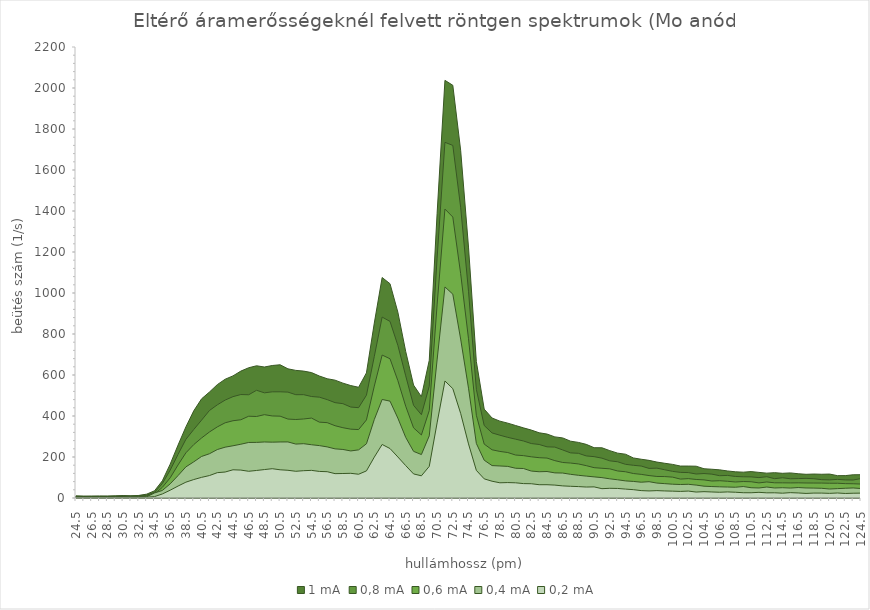
| Category | 1 mA | 0,8 mA | 0,6 mA | 0,4 mA | 0,2 mA |
|---|---|---|---|---|---|
| 24.5 | 10.4 | 7.5 | 6 | 3.8 | 2.1 |
| 25.5 | 9.5 | 7.2 | 4.8 | 4 | 1.8 |
| 26.5 | 9.4 | 7.8 | 6.3 | 4 | 2.1 |
| 27.5 | 10.2 | 7.3 | 5.8 | 4.3 | 2 |
| 28.5 | 9.4 | 8.3 | 6.4 | 4.8 | 2.3 |
| 29.5 | 10.6 | 8.5 | 6.3 | 4.5 | 2.1 |
| 30.5 | 12.1 | 8.6 | 7.7 | 5.3 | 2.8 |
| 31.5 | 10.8 | 9.3 | 7.2 | 5.6 | 2.5 |
| 32.5 | 12.5 | 11.8 | 7.1 | 6 | 2.6 |
| 33.5 | 18.8 | 14.2 | 10.3 | 6 | 3.7 |
| 34.5 | 35 | 26.8 | 19.9 | 24.6 | 6.8 |
| 35.5 | 83.8 | 70.4 | 52 | 36.8 | 19.7 |
| 36.5 | 165.2 | 135.9 | 98.4 | 69 | 38.1 |
| 37.5 | 258.1 | 212.7 | 161.3 | 109.4 | 58.3 |
| 38.5 | 346.8 | 286.1 | 220.4 | 151.8 | 77.2 |
| 39.5 | 425.1 | 334.1 | 260.5 | 176.3 | 90 |
| 40.5 | 483.9 | 379.9 | 292.9 | 202.7 | 100.7 |
| 41.5 | 516.9 | 426.7 | 322.1 | 215.8 | 109.5 |
| 42.5 | 553 | 454.4 | 346.8 | 236.3 | 123.6 |
| 43.5 | 579.4 | 477.6 | 366.9 | 247.9 | 126.7 |
| 44.5 | 595.7 | 494.5 | 376.9 | 254.8 | 137.6 |
| 45.5 | 619 | 504.7 | 381.7 | 262.3 | 136.2 |
| 46.5 | 635.4 | 503.6 | 398.9 | 270.9 | 130.3 |
| 47.5 | 644.9 | 525.4 | 397.6 | 271.3 | 134.3 |
| 48.5 | 639 | 513 | 406.5 | 273.3 | 138.7 |
| 49.5 | 646.3 | 517.9 | 400.2 | 272.4 | 142.9 |
| 50.5 | 649.9 | 518 | 399.2 | 273.3 | 137.6 |
| 51.5 | 630.1 | 516.5 | 385 | 273.5 | 135.2 |
| 52.5 | 622.5 | 503.9 | 382.9 | 263.1 | 130.3 |
| 53.5 | 619 | 504.1 | 385.4 | 264.9 | 133.2 |
| 54.5 | 611.8 | 495 | 389.9 | 259.8 | 134.8 |
| 55.5 | 595.1 | 491.9 | 370 | 255.6 | 129.6 |
| 56.5 | 581.8 | 479.9 | 367.6 | 249.3 | 128.3 |
| 57.5 | 574.8 | 465.1 | 352.6 | 239.7 | 118.8 |
| 58.5 | 560.3 | 460.2 | 342.9 | 236.8 | 119.5 |
| 59.5 | 548.5 | 443.6 | 335.8 | 229.5 | 120.4 |
| 60.5 | 540.1 | 440.6 | 333.8 | 234.8 | 115.9 |
| 61.5 | 610.3 | 501.5 | 380.9 | 264.4 | 132.2 |
| 62.5 | 853.5 | 690.4 | 545.8 | 383 | 199.4 |
| 63.5 | 1075.5 | 882.6 | 697.3 | 480.6 | 261.1 |
| 64.5 | 1045.3 | 861.4 | 679.2 | 472.5 | 241.3 |
| 65.5 | 906.5 | 744.6 | 572.5 | 389.6 | 200.2 |
| 66.5 | 715 | 596 | 447.8 | 295.8 | 158.1 |
| 67.5 | 550.9 | 452.1 | 342.2 | 227.5 | 117.5 |
| 68.5 | 494.3 | 406.4 | 307.5 | 211.9 | 108.3 |
| 69.5 | 671.5 | 545.2 | 426.6 | 302.9 | 154.2 |
| 70.5 | 1387.6 | 1170 | 941.8 | 673.5 | 366.4 |
| 71.5 | 2037.3 | 1735 | 1409.5 | 1029.5 | 570.8 |
| 72.5 | 2013.3 | 1719.9 | 1370.5 | 994.4 | 533.5 |
| 73.5 | 1696.3 | 1418.5 | 1094.5 | 775.2 | 412.8 |
| 74.5 | 1224 | 1008.5 | 776.8 | 535.6 | 263.8 |
| 75.5 | 665.6 | 529.6 | 403.4 | 266.1 | 134.7 |
| 76.5 | 433.6 | 353.6 | 262.9 | 184.4 | 93.4 |
| 77.5 | 390.2 | 317.4 | 235.2 | 158.1 | 81.8 |
| 78.5 | 374.9 | 306.2 | 227.1 | 156.2 | 74.2 |
| 79.5 | 365.1 | 295.8 | 221.8 | 154.2 | 75.3 |
| 80.5 | 353.6 | 286.9 | 209.6 | 145.1 | 74.1 |
| 81.5 | 342.1 | 278.1 | 206.7 | 143.9 | 70.2 |
| 82.5 | 331.4 | 265.6 | 200.9 | 131.4 | 69.6 |
| 83.5 | 318.2 | 261.1 | 196.6 | 128.1 | 64.8 |
| 84.5 | 311.9 | 249.6 | 194.8 | 129.2 | 64.8 |
| 85.5 | 298.1 | 248.3 | 182.3 | 122.5 | 62.9 |
| 86.5 | 293.1 | 234.4 | 173.3 | 121.7 | 59 |
| 87.5 | 277.2 | 220.1 | 170.5 | 115.5 | 57.1 |
| 88.5 | 271.2 | 218 | 166.1 | 110.8 | 55.7 |
| 89.5 | 261.6 | 205.2 | 157.8 | 106.8 | 53.5 |
| 90.5 | 245.4 | 201.7 | 148 | 103 | 54.2 |
| 91.5 | 245 | 194.3 | 145 | 99.4 | 45.5 |
| 92.5 | 231 | 181.3 | 142.2 | 93.5 | 47.3 |
| 93.5 | 218.9 | 176.7 | 131.8 | 88.8 | 46.6 |
| 94.5 | 213.6 | 164.3 | 128 | 83.4 | 43.4 |
| 95.5 | 195.4 | 159.6 | 119.4 | 80.8 | 40.7 |
| 96.5 | 189.1 | 155.9 | 115.3 | 77 | 36.1 |
| 97.5 | 183.6 | 144.4 | 109.5 | 79.5 | 34.4 |
| 98.5 | 175.3 | 145.6 | 105.1 | 72.8 | 36 |
| 99.5 | 169.4 | 137.8 | 104.5 | 70 | 34.4 |
| 100.5 | 163.9 | 129.9 | 101.8 | 67.3 | 33.4 |
| 101.5 | 155.8 | 125 | 92.2 | 65.8 | 32.1 |
| 102.5 | 155.8 | 124 | 94.5 | 66.9 | 33.8 |
| 103.5 | 155.1 | 117 | 90.4 | 63 | 29 |
| 104.5 | 142.7 | 119.3 | 88.3 | 57.6 | 30.9 |
| 105.5 | 140.3 | 116.4 | 82.8 | 55.8 | 29.4 |
| 106.5 | 137.2 | 108.7 | 84.3 | 54.5 | 28 |
| 107.5 | 131.9 | 110.2 | 81.6 | 53.5 | 29.6 |
| 108.5 | 127.8 | 105 | 78.1 | 52.5 | 28.1 |
| 109.5 | 126 | 103.5 | 80.3 | 55.9 | 25.7 |
| 110.5 | 128.8 | 103 | 79.3 | 50.1 | 25.6 |
| 111.5 | 125 | 99.5 | 73.7 | 48.8 | 27.6 |
| 112.5 | 121.2 | 103.8 | 78.2 | 53.5 | 25.2 |
| 113.5 | 123.5 | 94.2 | 74.1 | 48.8 | 25.4 |
| 114.5 | 120.5 | 98.8 | 74 | 50.2 | 23.4 |
| 115.5 | 122.4 | 93.8 | 73.5 | 48.4 | 26.1 |
| 116.5 | 118.3 | 94.6 | 74 | 51 | 24.6 |
| 117.5 | 115.6 | 95.8 | 73.2 | 48.9 | 22.3 |
| 118.5 | 116.9 | 94 | 73 | 48.3 | 24 |
| 119.5 | 115.8 | 89.4 | 72.8 | 47.3 | 23.9 |
| 120.5 | 116.7 | 88.4 | 72 | 43.8 | 22.6 |
| 121.5 | 109 | 90.8 | 72 | 45.7 | 24.4 |
| 122.5 | 109.2 | 88.2 | 70 | 47.5 | 22.1 |
| 123.5 | 113.3 | 87.8 | 69.5 | 49 | 23.3 |
| 124.5 | 113.7 | 94.8 | 68 | 46.2 | 23.8 |